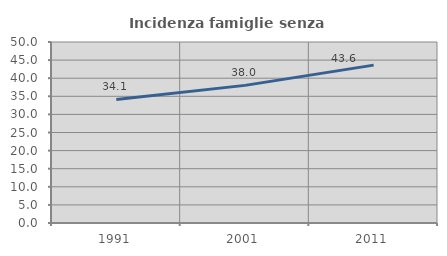
| Category | Incidenza famiglie senza nuclei |
|---|---|
| 1991.0 | 34.133 |
| 2001.0 | 38.018 |
| 2011.0 | 43.612 |